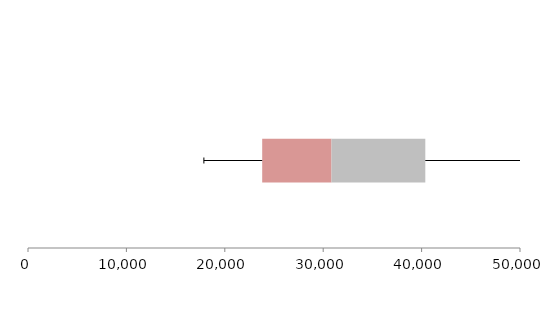
| Category | Series 1 | Series 2 | Series 3 |
|---|---|---|---|
| 0 | 23800.578 | 7043.57 | 9532.38 |